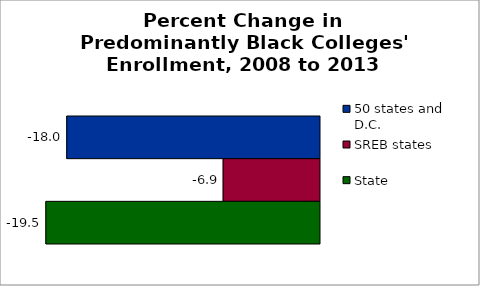
| Category | 50 states and D.C. | SREB states | State |
|---|---|---|---|
| 2009 to 2014 | -17.996 | -6.859 | -19.482 |